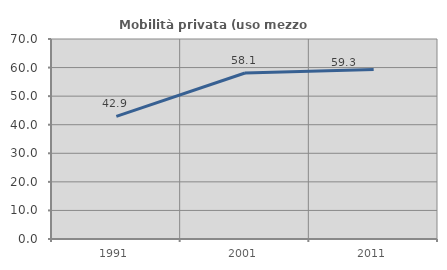
| Category | Mobilità privata (uso mezzo privato) |
|---|---|
| 1991.0 | 42.898 |
| 2001.0 | 58.098 |
| 2011.0 | 59.306 |